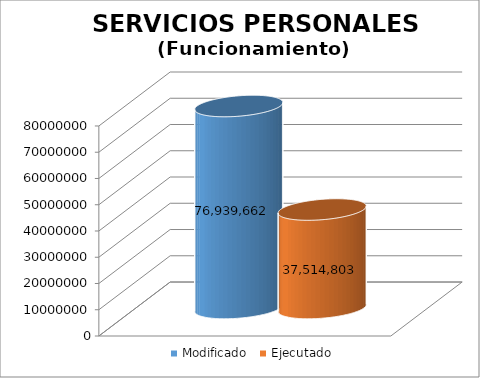
| Category | Modificado | Ejecutado |
|---|---|---|
| 0 | 76939662 | 37514802.95 |